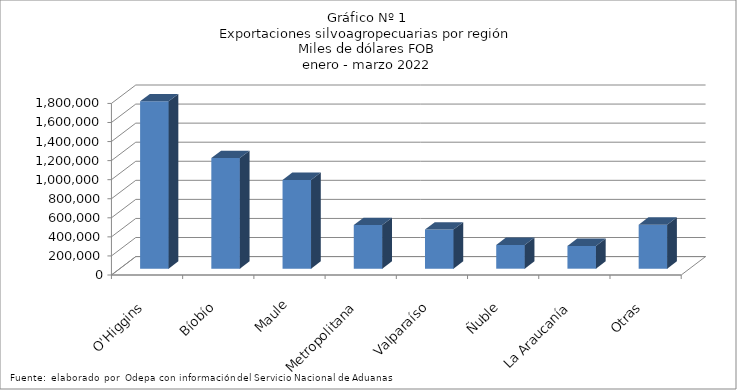
| Category | Series 0 |
|---|---|
| O'Higgins | 1756107.794 |
| Bíobío | 1160832.877 |
| Maule | 931757.162 |
| Metropolitana | 457769.215 |
| Valparaíso | 410690.697 |
| Ñuble | 248702.884 |
| La Araucanía | 239289.658 |
| Otras | 461841.31 |